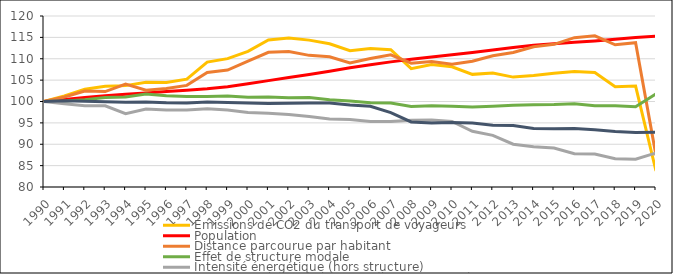
| Category | Émissions de CO2 du transport de voyageurs | Population | Distance parcourue par habitant | Effet de structure modale | Intensité énergétique (hors structure) | Contenu carbone de l'énergie (hors structure) |
|---|---|---|---|---|---|---|
| 1990.0 | 100 | 100 | 100 | 100 | 100 | 100 |
| 1991.0 | 101.302 | 100.47 | 101.049 | 100.118 | 99.472 | 100.193 |
| 1992.0 | 102.889 | 100.936 | 102.458 | 100.427 | 98.996 | 100.07 |
| 1993.0 | 103.578 | 101.337 | 102.319 | 100.949 | 99.009 | 99.946 |
| 1994.0 | 103.713 | 101.675 | 104.09 | 101.072 | 97.133 | 99.819 |
| 1995.0 | 104.516 | 102.002 | 102.651 | 101.726 | 98.253 | 99.871 |
| 1996.0 | 104.456 | 102.323 | 103.049 | 101.355 | 98.031 | 99.703 |
| 1997.0 | 105.234 | 102.643 | 103.77 | 101.145 | 98.018 | 99.656 |
| 1998.0 | 109.217 | 102.978 | 106.781 | 101.166 | 98.302 | 99.874 |
| 1999.0 | 110.033 | 103.471 | 107.366 | 101.309 | 98.022 | 99.74 |
| 2000.0 | 111.727 | 104.15 | 109.424 | 100.973 | 97.421 | 99.662 |
| 2001.0 | 114.41 | 104.88 | 111.504 | 101.068 | 97.265 | 99.519 |
| 2002.0 | 114.872 | 105.616 | 111.715 | 100.871 | 96.936 | 99.568 |
| 2003.0 | 114.359 | 106.339 | 110.793 | 100.929 | 96.512 | 99.648 |
| 2004.0 | 113.501 | 107.099 | 110.452 | 100.407 | 95.908 | 99.638 |
| 2005.0 | 111.866 | 107.887 | 109.029 | 100.108 | 95.782 | 99.182 |
| 2006.0 | 112.371 | 108.621 | 110.049 | 99.735 | 95.324 | 98.88 |
| 2007.0 | 112.129 | 109.269 | 110.926 | 99.644 | 95.312 | 97.407 |
| 2008.0 | 107.669 | 109.86 | 108.959 | 98.807 | 95.602 | 95.222 |
| 2009.0 | 108.629 | 110.416 | 109.376 | 99.03 | 95.653 | 94.957 |
| 2010.0 | 108.113 | 110.949 | 108.739 | 98.874 | 95.331 | 95.073 |
| 2011.0 | 106.349 | 111.487 | 109.4 | 98.706 | 93.038 | 94.948 |
| 2012.0 | 106.656 | 112.041 | 110.688 | 98.893 | 92.086 | 94.44 |
| 2013.0 | 105.706 | 112.615 | 111.47 | 99.12 | 90.015 | 94.377 |
| 2014.0 | 106.09 | 113.147 | 112.818 | 99.253 | 89.391 | 93.674 |
| 2015.0 | 106.626 | 113.536 | 113.368 | 99.275 | 89.11 | 93.642 |
| 2016.0 | 107.016 | 113.834 | 114.927 | 99.488 | 87.788 | 93.659 |
| 2017.0 | 106.788 | 114.165 | 115.352 | 98.983 | 87.736 | 93.374 |
| 2018.0 | 103.441 | 114.568 | 113.273 | 98.987 | 86.589 | 92.996 |
| 2019.0 | 103.603 | 114.957 | 113.766 | 98.755 | 86.502 | 92.735 |
| 2020.0 | 83.751 | 115.266 | 87.401 | 101.801 | 87.966 | 92.833 |